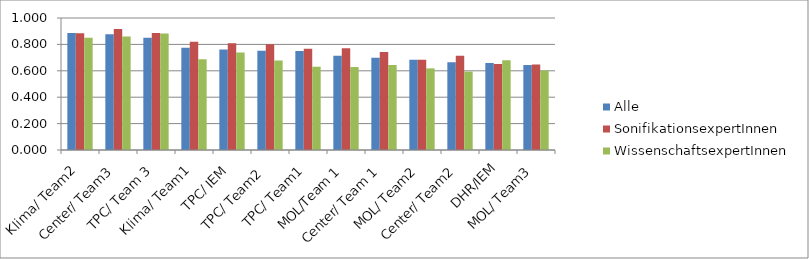
| Category | Alle | SonifikationsexpertInnen | WissenschaftsexpertInnen |
|---|---|---|---|
| Klima/ Team2 | 0.886 | 0.885 | 0.851 |
| Center/ Team3 | 0.876 | 0.917 | 0.861 |
| TPC/ Team 3 | 0.851 | 0.887 | 0.883 |
| Klima/ Team1 | 0.774 | 0.82 | 0.688 |
| TPC/ IEM | 0.761 | 0.809 | 0.74 |
| TPC/ Team2  | 0.751 | 0.801 | 0.679 |
| TPC/ Team1 | 0.749 | 0.767 | 0.631 |
| MOL/Team 1 | 0.714 | 0.771 | 0.628 |
| Center/ Team 1 | 0.698 | 0.742 | 0.644 |
| MOL/ Team2 | 0.683 | 0.684 | 0.618 |
| Center/ Team2 | 0.665 | 0.714 | 0.594 |
| DHR/IEM | 0.659 | 0.652 | 0.679 |
| MOL/ Team3 | 0.644 | 0.647 | 0.601 |